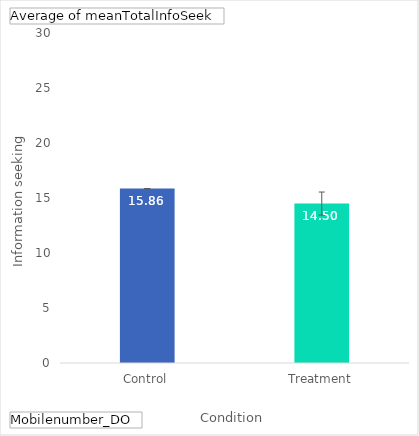
| Category | Total |
|---|---|
| Control | 15.859 |
| Treatment | 14.495 |